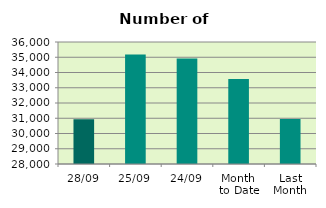
| Category | Series 0 |
|---|---|
| 28/09 | 30934 |
| 25/09 | 35178 |
| 24/09 | 34914 |
| Month 
to Date | 33578.6 |
| Last
Month | 30949.143 |